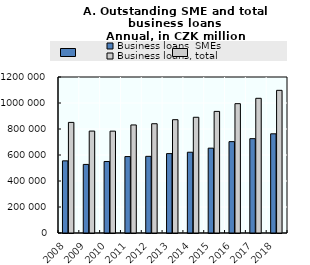
| Category | Business loans, SMEs | Business loans, total |
|---|---|---|
| 2008.0 | 555030 | 850765 |
| 2009.0 | 527545 | 784069 |
| 2010.0 | 550072 | 783538 |
| 2011.0 | 587908 | 831206 |
| 2012.0 | 589675 | 840593 |
| 2013.0 | 610789 | 871578 |
| 2014.0 | 621385 | 890229 |
| 2015.0 | 652590 | 935364 |
| 2016.0 | 702814 | 994855 |
| 2017.0 | 725631 | 1036131 |
| 2018.0 | 762997 | 1097391 |